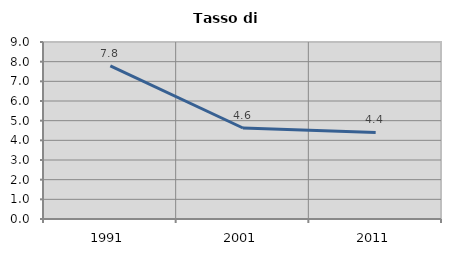
| Category | Tasso di disoccupazione   |
|---|---|
| 1991.0 | 7.786 |
| 2001.0 | 4.628 |
| 2011.0 | 4.399 |